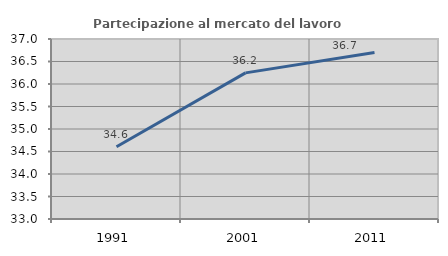
| Category | Partecipazione al mercato del lavoro  femminile |
|---|---|
| 1991.0 | 34.607 |
| 2001.0 | 36.247 |
| 2011.0 | 36.699 |